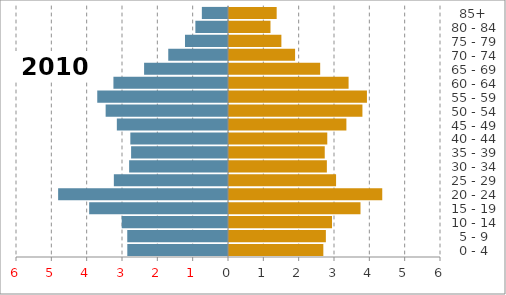
| Category | Male | Female |
|---|---|---|
|   0 - 4 | -2.85 | 2.67 |
|   5 - 9 | -2.851 | 2.742 |
| 10 - 14 | -3.007 | 2.916 |
| 15 - 19 | -3.929 | 3.722 |
| 20 - 24 | -4.808 | 4.337 |
| 25 - 29 | -3.231 | 3.03 |
| 30 - 34 | -2.798 | 2.77 |
| 35 - 39 | -2.742 | 2.71 |
| 40 - 44 | -2.764 | 2.781 |
| 45 - 49 | -3.146 | 3.322 |
| 50 - 54 | -3.463 | 3.776 |
| 55 - 59 | -3.7 | 3.904 |
| 60 - 64 | -3.243 | 3.384 |
| 65 - 69 | -2.375 | 2.581 |
| 70 - 74 | -1.691 | 1.87 |
| 75 - 79 | -1.217 | 1.483 |
| 80 - 84 | -0.923 | 1.174 |
|   85+ | -0.74 | 1.349 |